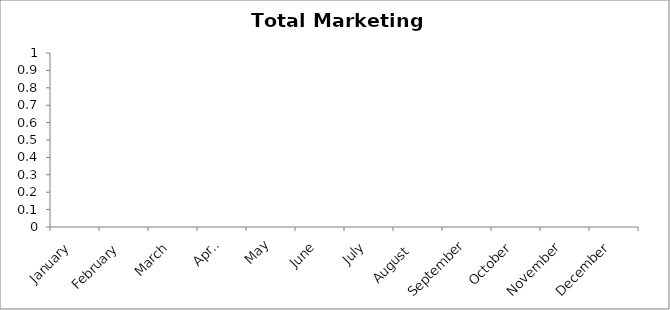
| Category | Total |
|---|---|
| January | 0 |
| February | 0 |
| March | 0 |
| April | 0 |
| May | 0 |
| June | 0 |
| July | 0 |
| August  | 0 |
| September | 0 |
| October | 0 |
| November | 0 |
| December | 0 |